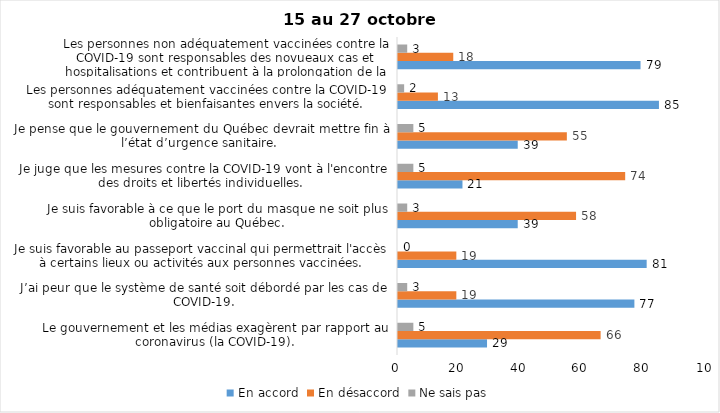
| Category | En accord | En désaccord | Ne sais pas |
|---|---|---|---|
| Le gouvernement et les médias exagèrent par rapport au coronavirus (la COVID-19). | 29 | 66 | 5 |
| J’ai peur que le système de santé soit débordé par les cas de COVID-19. | 77 | 19 | 3 |
| Je suis favorable au passeport vaccinal qui permettrait l'accès à certains lieux ou activités aux personnes vaccinées. | 81 | 19 | 0 |
| Je suis favorable à ce que le port du masque ne soit plus obligatoire au Québec. | 39 | 58 | 3 |
| Je juge que les mesures contre la COVID-19 vont à l'encontre des droits et libertés individuelles.  | 21 | 74 | 5 |
| Je pense que le gouvernement du Québec devrait mettre fin à l’état d’urgence sanitaire.  | 39 | 55 | 5 |
| Les personnes adéquatement vaccinées contre la COVID-19 sont responsables et bienfaisantes envers la société. | 85 | 13 | 2 |
| Les personnes non adéquatement vaccinées contre la COVID-19 sont responsables des novueaux cas et hospitalisations et contribuent à la prolongation de la pandémie au Québec. | 79 | 18 | 3 |